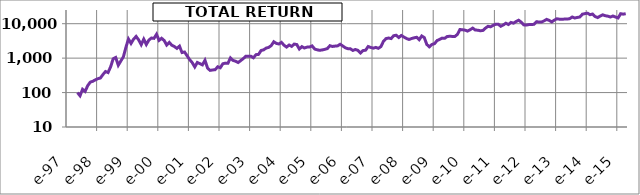
| Category | TOTAL RETURN AMAZON |
|---|---|
| 1997-05-15 | 100 |
| 1997-06-15 | 80.85 |
| 1997-07-15 | 124.47 |
| 1997-08-15 | 107.98 |
| 1997-09-15 | 157.98 |
| 1997-10-15 | 200.27 |
| 1997-11-15 | 212.77 |
| 1997-12-15 | 234.04 |
| 1998-01-15 | 252.93 |
| 1998-02-15 | 264.89 |
| 1998-03-15 | 334.84 |
| 1998-04-15 | 409.04 |
| 1998-05-15 | 381.38 |
| 1998-06-15 | 559.57 |
| 1998-07-15 | 957.45 |
| 1998-08-15 | 1044.68 |
| 1998-09-15 | 621.28 |
| 1998-10-15 | 826.06 |
| 1998-11-15 | 1087.23 |
| 1998-12-15 | 2065.96 |
| 1999-01-15 | 3584.04 |
| 1999-02-15 | 2668.08 |
| 1999-03-15 | 3547.34 |
| 1999-04-15 | 4270.21 |
| 1999-05-15 | 3379.79 |
| 1999-06-15 | 2463.83 |
| 1999-07-15 | 3563.3 |
| 1999-08-15 | 2487.77 |
| 1999-09-15 | 3347.87 |
| 1999-10-15 | 3832.98 |
| 1999-11-15 | 3753.19 |
| 1999-12-15 | 4927.66 |
| 2000-01-15 | 3280.85 |
| 2000-02-15 | 3769.15 |
| 2000-03-15 | 3255.32 |
| 2000-04-15 | 2393.62 |
| 2000-05-15 | 2862.77 |
| 2000-06-15 | 2364.89 |
| 2000-07-15 | 2170.21 |
| 2000-08-15 | 1918.08 |
| 2000-09-15 | 2227.66 |
| 2000-10-15 | 1452.13 |
| 2000-11-15 | 1506.38 |
| 2000-12-15 | 1168.08 |
| 2001-01-15 | 903.19 |
| 2001-02-15 | 740.43 |
| 2001-03-15 | 555.32 |
| 2001-04-15 | 749.11 |
| 2001-05-15 | 691.4 |
| 2001-06-15 | 637.79 |
| 2001-07-15 | 867.06 |
| 2001-08-15 | 514.72 |
| 2001-09-15 | 440.68 |
| 2001-10-15 | 453.45 |
| 2001-11-15 | 462.13 |
| 2001-12-15 | 561.7 |
| 2002-01-15 | 525.45 |
| 2002-02-15 | 684.77 |
| 2002-03-15 | 716.43 |
| 2002-04-15 | 709.28 |
| 2002-05-15 | 1018.21 |
| 2002-06-15 | 858.89 |
| 2002-07-15 | 813.96 |
| 2002-08-15 | 746.55 |
| 2002-09-15 | 848.17 |
| 2002-10-15 | 967.15 |
| 2002-11-15 | 1134.13 |
| 2002-12-15 | 1132.6 |
| 2003-01-15 | 1137.19 |
| 2003-02-15 | 1024.34 |
| 2003-03-15 | 1261.79 |
| 2003-04-15 | 1283.23 |
| 2003-05-15 | 1666.21 |
| 2003-06-15 | 1742.81 |
| 2003-07-15 | 1962.38 |
| 2003-08-15 | 2047.66 |
| 2003-09-15 | 2323.91 |
| 2003-10-15 | 2989.28 |
| 2003-11-15 | 2678.3 |
| 2003-12-15 | 2574.13 |
| 2004-01-15 | 2868.77 |
| 2004-02-15 | 2368.34 |
| 2004-03-15 | 2097.7 |
| 2004-04-15 | 2399.49 |
| 2004-05-15 | 2198.3 |
| 2004-06-15 | 2558.81 |
| 2004-07-15 | 2485.28 |
| 2004-08-15 | 1844.94 |
| 2004-09-15 | 2155.4 |
| 2004-10-15 | 1968.51 |
| 2004-11-15 | 2088 |
| 2004-12-15 | 2093.62 |
| 2005-01-15 | 2274.89 |
| 2005-02-15 | 1845.45 |
| 2005-03-15 | 1745.36 |
| 2005-04-15 | 1686.13 |
| 2005-05-15 | 1731.06 |
| 2005-06-15 | 1799.49 |
| 2005-07-15 | 1897.02 |
| 2005-08-15 | 2299.91 |
| 2005-09-15 | 2180.94 |
| 2005-10-15 | 2236.08 |
| 2005-11-15 | 2269.79 |
| 2005-12-15 | 2526.64 |
| 2006-01-15 | 2267.23 |
| 2006-02-15 | 2004.77 |
| 2006-03-15 | 1883.74 |
| 2006-04-15 | 1869.96 |
| 2006-05-15 | 1673.87 |
| 2006-06-15 | 1785.19 |
| 2006-07-15 | 1681.02 |
| 2006-08-15 | 1418.04 |
| 2006-09-15 | 1660.59 |
| 2006-10-15 | 1701.45 |
| 2006-11-15 | 2175.32 |
| 2006-12-15 | 2043.06 |
| 2007-01-15 | 1950.64 |
| 2007-02-15 | 2045.62 |
| 2007-03-15 | 1929.19 |
| 2007-04-15 | 2165.62 |
| 2007-05-15 | 3093.45 |
| 2007-06-15 | 3697.02 |
| 2007-07-15 | 3834.89 |
| 2007-08-15 | 3696 |
| 2007-09-15 | 4481.87 |
| 2007-10-15 | 4622.8 |
| 2007-11-15 | 3975.32 |
| 2007-12-15 | 4548.76 |
| 2008-01-15 | 4097.36 |
| 2008-02-15 | 3725.62 |
| 2008-03-15 | 3483.57 |
| 2008-04-15 | 3702.13 |
| 2008-05-15 | 3886.98 |
| 2008-06-15 | 4042.72 |
| 2008-07-15 | 3422.81 |
| 2008-08-15 | 4411.91 |
| 2008-09-15 | 3949.28 |
| 2008-10-15 | 2487.83 |
| 2008-11-15 | 2131.91 |
| 2008-12-15 | 2494.47 |
| 2009-01-15 | 2626.72 |
| 2009-02-15 | 3230.3 |
| 2009-03-15 | 3504.51 |
| 2009-04-15 | 3814.98 |
| 2009-05-15 | 3758.3 |
| 2009-06-15 | 4247.49 |
| 2009-07-15 | 4317.45 |
| 2009-08-15 | 4267.91 |
| 2009-09-15 | 4266.38 |
| 2009-10-15 | 4902.64 |
| 2009-11-15 | 6789.95 |
| 2009-12-15 | 6650.04 |
| 2010-01-15 | 6492.25 |
| 2010-02-15 | 6110.3 |
| 2010-03-15 | 6696 |
| 2010-04-15 | 7446.13 |
| 2010-05-15 | 6563.38 |
| 2010-06-15 | 6476.93 |
| 2010-07-15 | 6232.85 |
| 2010-08-15 | 6367.14 |
| 2010-09-15 | 7427.23 |
| 2010-10-15 | 8407.15 |
| 2010-11-15 | 8114.04 |
| 2010-12-15 | 8965.27 |
| 2011-01-15 | 9638.3 |
| 2011-02-15 | 9652.59 |
| 2011-03-15 | 8429.61 |
| 2011-04-15 | 9192 |
| 2011-05-15 | 10343.49 |
| 2011-06-15 | 9496.85 |
| 2011-07-15 | 10869.96 |
| 2011-08-15 | 10363.4 |
| 2011-09-15 | 11580.25 |
| 2011-10-15 | 12597.95 |
| 2011-11-15 | 11123.23 |
| 2011-12-15 | 9255.83 |
| 2012-01-15 | 9110.8 |
| 2012-02-15 | 9419.74 |
| 2012-03-15 | 9417.7 |
| 2012-04-15 | 9623.49 |
| 2012-05-15 | 11458.21 |
| 2012-06-15 | 11149.79 |
| 2012-07-15 | 11151.83 |
| 2012-08-15 | 12123.57 |
| 2012-09-15 | 13341.43 |
| 2012-10-15 | 12468.76 |
| 2012-11-15 | 11264.63 |
| 2012-12-15 | 12724.59 |
| 2013-01-15 | 13884.25 |
| 2013-02-15 | 13536.5 |
| 2013-03-15 | 13369.52 |
| 2013-04-15 | 13670.8 |
| 2013-05-15 | 13611.56 |
| 2013-06-15 | 13990.98 |
| 2013-07-15 | 15654.63 |
| 2013-08-15 | 14628.25 |
| 2013-09-15 | 15212.93 |
| 2013-10-15 | 15645.95 |
| 2013-11-15 | 18851.23 |
| 2013-12-15 | 19620.76 |
| 2014-01-15 | 20214.63 |
| 2014-02-15 | 18247.65 |
| 2014-03-15 | 19084.59 |
| 2014-04-15 | 16140.25 |
| 2014-05-15 | 15073.53 |
| 2014-06-15 | 16660.58 |
| 2014-07-15 | 18099.06 |
| 2014-08-15 | 17036.42 |
| 2014-09-15 | 16539.05 |
| 2014-10-15 | 15624 |
| 2014-11-15 | 16739.75 |
| 2014-12-15 | 15629.11 |
| 2015-01-15 | 14652.76 |
| 2015-02-15 | 19497.7 |
| 2015-03-15 | 18923.23 |
| 2015-04-15 | 19580.42 |